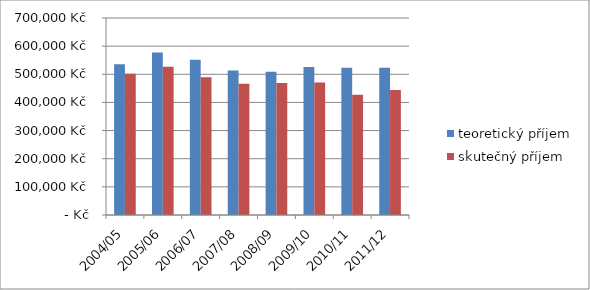
| Category | teoretický příjem | skutečný příjem |
|---|---|---|
| 2004/05 | 535800 | 502100 |
| 2005/06 | 577800 | 526800 |
| 2006/07 | 552000 | 489600 |
| 2007/08 | 513600 | 466800 |
| 2008/09 | 508800 | 468800 |
| 2009/10 | 525600 | 470400 |
| 2010/11 | 523200 | 426900 |
| 2011/12 | 523200 | 444000 |